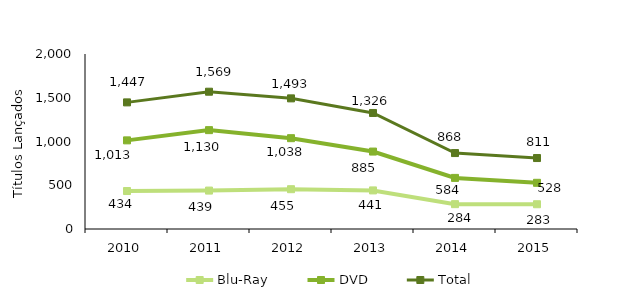
| Category | Blu-Ray | DVD | Total |
|---|---|---|---|
| 2010.0 | 434 | 1013 | 1447 |
| 2011.0 | 439 | 1130 | 1569 |
| 2012.0 | 455 | 1038 | 1493 |
| 2013.0 | 441 | 885 | 1326 |
| 2014.0 | 284 | 584 | 868 |
| 2015.0 | 283 | 528 | 811 |